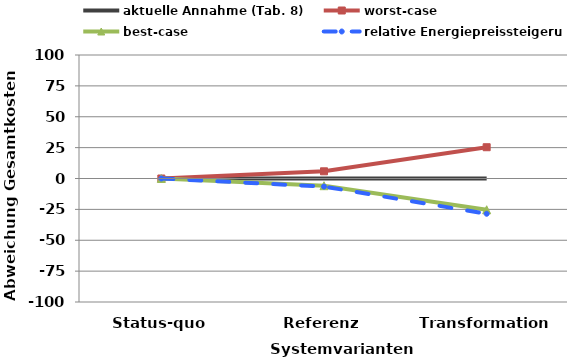
| Category | aktuelle Annahme (Tab. 8) | worst-case | best-case | relative Energiepreissteigerung |
|---|---|---|---|---|
| Status-quo | 0 | 0 | 0 | 0 |
| Referenz | 0 | 5.831 | -5.831 | -6.529 |
| Transformation | 0 | 25.32 | -25.32 | -28.561 |